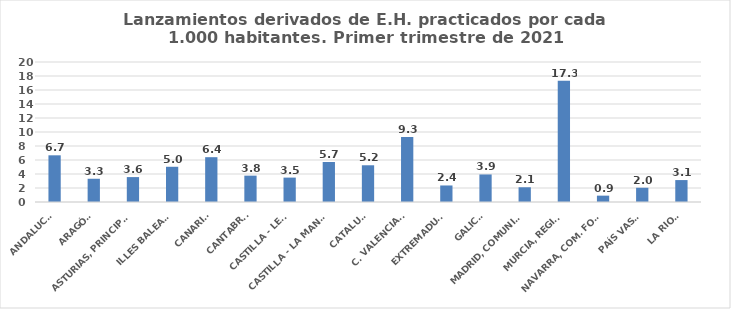
| Category | 616 |
|---|---|
| ANDALUCÍA | 6.671 |
| ARAGÓN | 3.32 |
| ASTURIAS, PRINCIPADO | 3.559 |
| ILLES BALEARS | 5.033 |
| CANARIAS | 6.402 |
| CANTABRIA | 3.765 |
| CASTILLA - LEÓN | 3.486 |
| CASTILLA - LA MANCHA | 5.713 |
| CATALUÑA | 5.247 |
| C. VALENCIANA | 9.268 |
| EXTREMADURA | 2.361 |
| GALICIA | 3.934 |
| MADRID, COMUNIDAD | 2.105 |
| MURCIA, REGIÓN | 17.326 |
| NAVARRA, COM. FORAL | 0.908 |
| PAÍS VASCO | 2.034 |
| LA RIOJA | 3.133 |